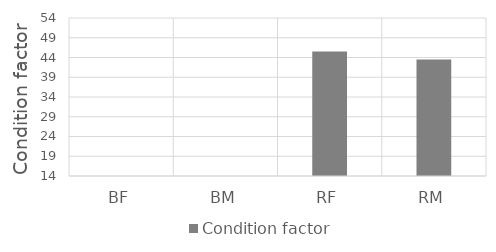
| Category | Condition factor |
|---|---|
| BF | 0 |
| BM | 0 |
| RF | 45.5 |
| RM | 43.5 |